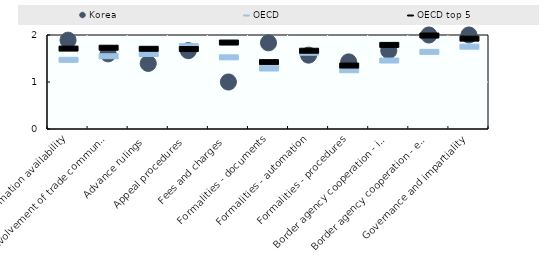
| Category | Korea | OECD | OECD top 5 |
|---|---|---|---|
| Information availability | 1.889 | 1.483 | 1.722 |
| Involvement of trade community | 1.6 | 1.559 | 1.74 |
| Advance rulings | 1.396 | 1.606 | 1.717 |
| Appeal procedures | 1.667 | 1.773 | 1.711 |
| Fees and charges | 1 | 1.535 | 1.85 |
| Formalities - documents | 1.833 | 1.297 | 1.433 |
| Formalities - automation | 1.571 | 1.633 | 1.676 |
| Formalities - procedures | 1.428 | 1.261 | 1.361 |
| Border agency cooperation - internal | 1.667 | 1.467 | 1.8 |
| Border agency cooperation - external | 2 | 1.652 | 2 |
| Governance and impartiality | 2 | 1.762 | 1.933 |